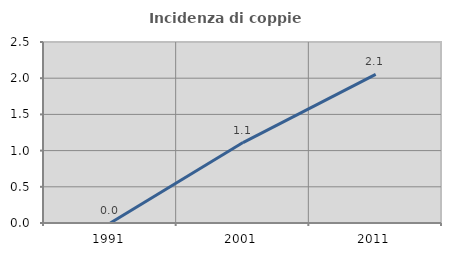
| Category | Incidenza di coppie miste |
|---|---|
| 1991.0 | 0 |
| 2001.0 | 1.111 |
| 2011.0 | 2.053 |